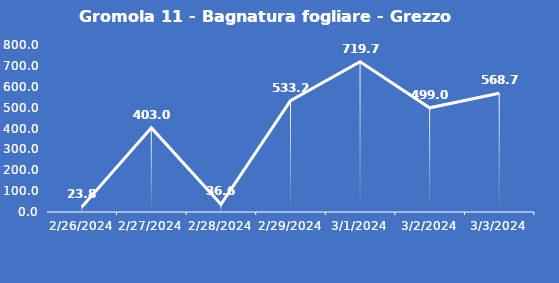
| Category | Gromola 11 - Bagnatura fogliare - Grezzo (min) |
|---|---|
| 2/26/24 | 23.8 |
| 2/27/24 | 403 |
| 2/28/24 | 36.6 |
| 2/29/24 | 533.2 |
| 3/1/24 | 719.7 |
| 3/2/24 | 499 |
| 3/3/24 | 568.7 |